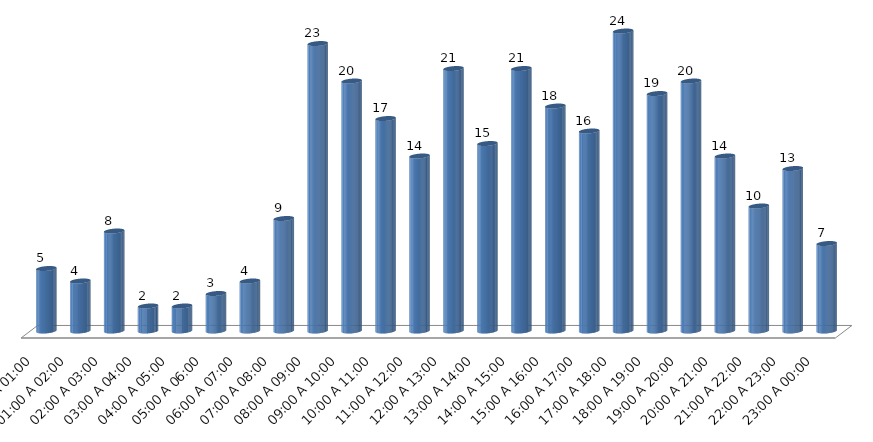
| Category | COMPUTO |
|---|---|
| 00:00 A 01:00 | 5 |
| 01:00 A 02:00 | 4 |
| 02:00 A 03:00 | 8 |
| 03:00 A 04:00 | 2 |
| 04:00 A 05:00 | 2 |
| 05:00 A 06:00 | 3 |
| 06:00 A 07:00 | 4 |
| 07:00 A 08:00 | 9 |
| 08:00 A 09:00 | 23 |
| 09:00 A 10:00 | 20 |
| 10:00 A 11:00 | 17 |
| 11:00 A 12:00 | 14 |
| 12:00 A 13:00 | 21 |
| 13:00 A 14:00 | 15 |
| 14:00 A 15:00 | 21 |
| 15:00 A 16:00 | 18 |
| 16:00 A 17:00 | 16 |
| 17:00 A 18:00 | 24 |
| 18:00 A 19:00 | 19 |
| 19:00 A 20:00 | 20 |
| 20:00 A 21:00 | 14 |
| 21:00 A 22:00 | 10 |
| 22:00 A 23:00 | 13 |
| 23:00 A 00:00 | 7 |